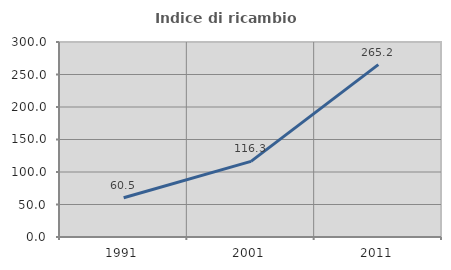
| Category | Indice di ricambio occupazionale  |
|---|---|
| 1991.0 | 60.465 |
| 2001.0 | 116.304 |
| 2011.0 | 265.198 |